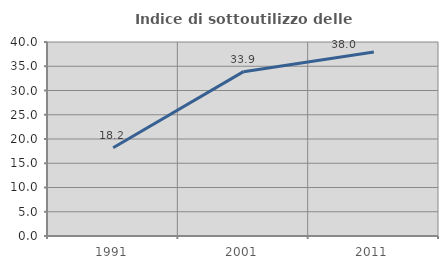
| Category | Indice di sottoutilizzo delle abitazioni  |
|---|---|
| 1991.0 | 18.182 |
| 2001.0 | 33.883 |
| 2011.0 | 37.959 |